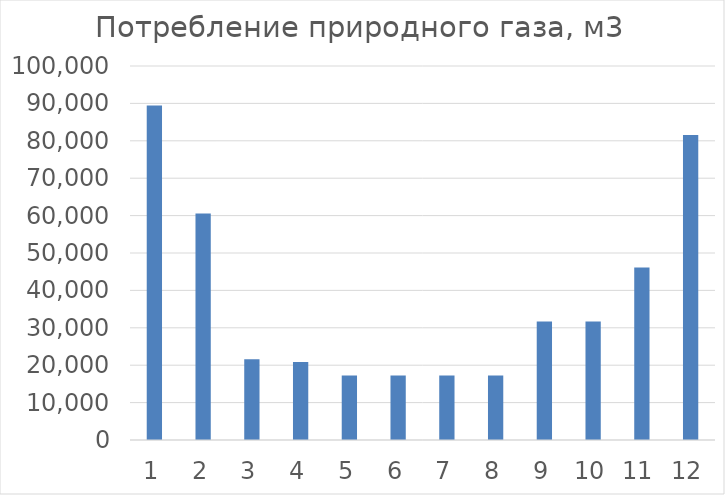
| Category | 452.585 |
|---|---|
| 0 | 89462.88 |
| 1 | 60580.594 |
| 2 | 21589.509 |
| 3 | 20867.451 |
| 4 | 17257.166 |
| 5 | 17257.166 |
| 6 | 17257.166 |
| 7 | 17257.166 |
| 8 | 31698.309 |
| 9 | 31698.309 |
| 10 | 46139.451 |
| 11 | 81520.251 |